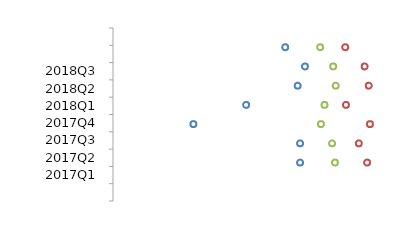
| Category | Categories |
|---|---|
|  | 84.091 |
| 2017Q1 | 0 |
| 2017Q2 | 0 |
| 2017Q3 | 0 |
| 2017Q4 | 0 |
| 2018Q1 | 0 |
| 2018Q2 | 0 |
| 2018Q3 | 0 |